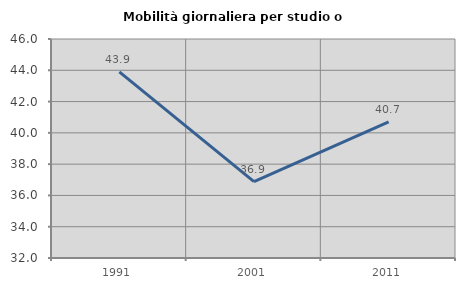
| Category | Mobilità giornaliera per studio o lavoro |
|---|---|
| 1991.0 | 43.902 |
| 2001.0 | 36.882 |
| 2011.0 | 40.698 |